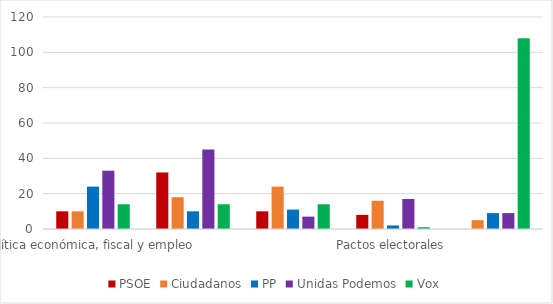
| Category | PSOE | Ciudadanos | PP | Unidas Podemos | Vox |
|---|---|---|---|---|---|
| Política económica, fiscal y empleo  | 10 | 10 | 24 | 33 | 14 |
| Política social, estado del bienestar, pensiones e igualdad | 32 | 18 | 10 | 45 | 14 |
| Política territorial | 10 | 24 | 11 | 7 | 14 |
| Pactos electorales | 8 | 16 | 2 | 17 | 1 |
| Otros | 0 | 5 | 9 | 9 | 108 |